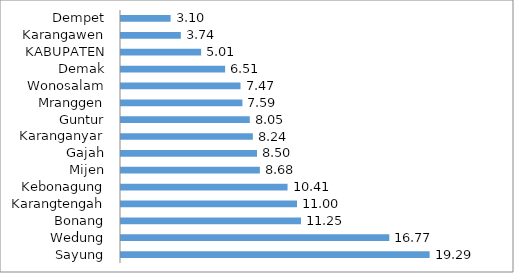
| Category | Series 0 |
|---|---|
| Sayung | 19.29 |
| Wedung | 16.77 |
| Bonang | 11.25 |
| Karangtengah | 11 |
| Kebonagung | 10.41 |
| Mijen | 8.68 |
| Gajah | 8.5 |
| Karanganyar | 8.24 |
| Guntur | 8.05 |
| Mranggen | 7.59 |
| Wonosalam | 7.47 |
| Demak | 6.51 |
| KABUPATEN | 5.01 |
| Karangawen | 3.74 |
| Dempet | 3.1 |